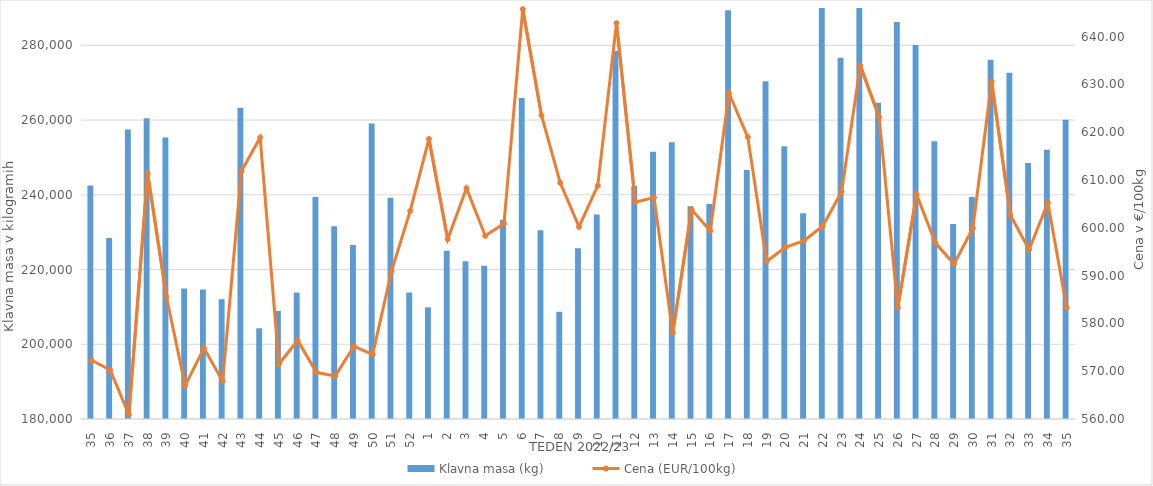
| Category | Klavna masa (kg) |
|---|---|
| 35.0 | 242516 |
| 36.0 | 228469 |
| 37.0 | 257511 |
| 38.0 | 260481 |
| 39.0 | 255370 |
| 40.0 | 214936 |
| 41.0 | 214672 |
| 42.0 | 212066 |
| 43.0 | 263287 |
| 44.0 | 204280 |
| 45.0 | 208920 |
| 46.0 | 213836 |
| 47.0 | 239417 |
| 48.0 | 231565 |
| 49.0 | 226575 |
| 50.0 | 259073 |
| 51.0 | 239211 |
| 52.0 | 213841 |
| 1.0 | 209877 |
| 2.0 | 225045 |
| 3.0 | 222198 |
| 4.0 | 221002 |
| 5.0 | 233306 |
| 6.0 | 265944 |
| 7.0 | 230531 |
| 8.0 | 208699 |
| 9.0 | 225712 |
| 10.0 | 234762 |
| 11.0 | 278467 |
| 12.0 | 242369 |
| 13.0 | 251507 |
| 14.0 | 254072 |
| 15.0 | 236964 |
| 16.0 | 237552 |
| 17.0 | 289400 |
| 18.0 | 246616 |
| 19.0 | 270374 |
| 20.0 | 252984 |
| 21.0 | 235060 |
| 22.0 | 290816 |
| 23.0 | 276702 |
| 24.0 | 292976 |
| 25.0 | 264669 |
| 26.0 | 286237 |
| 27.0 | 280112 |
| 28.0 | 254336 |
| 29.0 | 232178 |
| 30.0 | 239437 |
| 31.0 | 276163 |
| 32.0 | 272647 |
| 33.0 | 248536 |
| 34.0 | 252050 |
| 35.0 | 260110 |